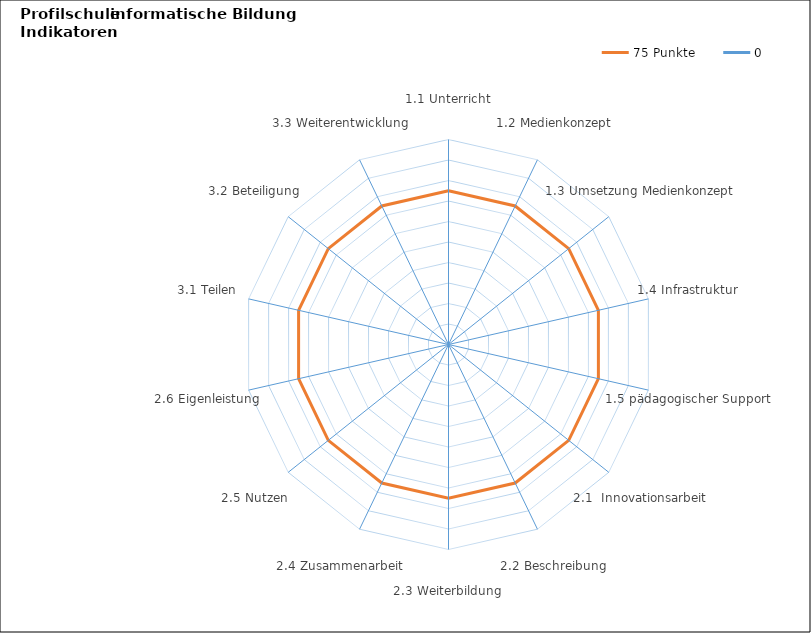
| Category | 75 Punkte | 0 | 100 Punkte |
|---|---|---|---|
| 1.1 Unterricht | 75 | 0 | 100 |
| 1.2 Medienkonzept | 75 | 0 | 100 |
| 1.3 Umsetzung Medienkonzept | 75 | 0 | 100 |
| 1.4 Infrastruktur | 75 | 0 | 100 |
| 1.5 pädagogischer Support | 75 | 0 | 100 |
| 2.1  Innovationsarbeit | 75 | 0 | 100 |
| 2.2 Beschreibung | 75 | 0 | 100 |
| 2.3 Weiterbildung | 75 | 0 | 100 |
| 2.4 Zusammenarbeit | 75 | 0 | 100 |
| 2.5 Nutzen | 75 | 0 | 100 |
| 2.6 Eigenleistung | 75 | 0 | 100 |
| 3.1 Teilen | 75 | 0 | 100 |
| 3.2 Beteiligung | 75 | 0 | 100 |
| 3.3 Weiterentwicklung | 75 | 0 | 100 |